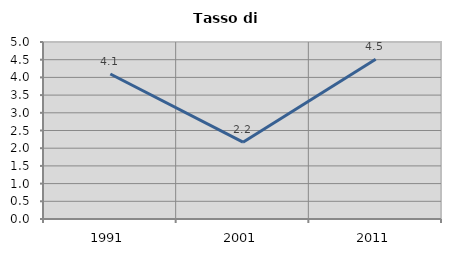
| Category | Tasso di disoccupazione   |
|---|---|
| 1991.0 | 4.095 |
| 2001.0 | 2.169 |
| 2011.0 | 4.515 |